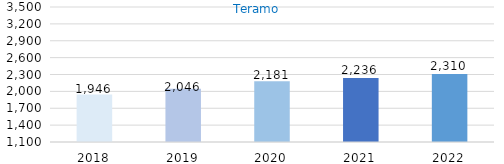
| Category | Series 0 |
|---|---|
| 2018.0 | 1946 |
| 2019.0 | 2046 |
| 2020.0 | 2181 |
| 2021.0 | 2236 |
| 2022.0 | 2310 |